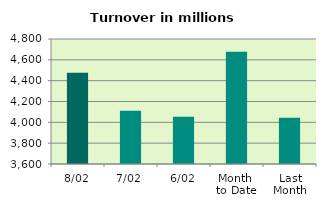
| Category | Series 0 |
|---|---|
| 8/02 | 4476.644 |
| 7/02 | 4111.484 |
| 6/02 | 4054.2 |
| Month 
to Date | 4677.599 |
| Last
Month | 4043.095 |